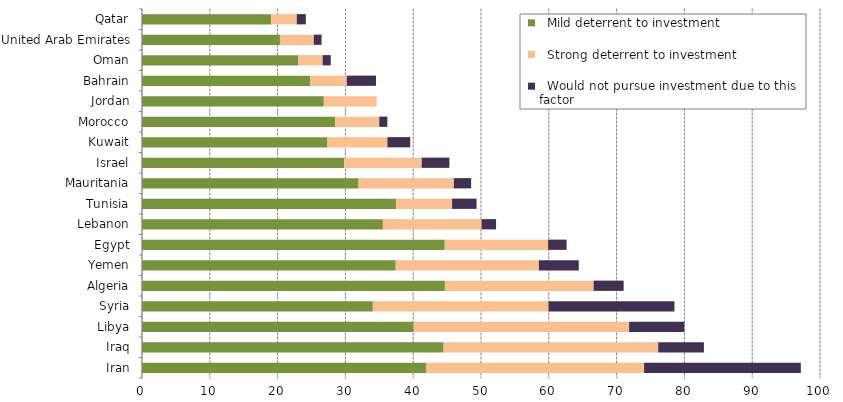
| Category |   Mild deterrent to investment |   Strong deterrent to investment |   Would not pursue investment due to this factor |
|---|---|---|---|
| Iran | 41.951 | 32.105 | 23.116 |
| Iraq | 44.489 | 31.651 | 6.737 |
| Libya | 40.067 | 31.782 | 8.134 |
| Syria | 34.044 | 25.92 | 18.569 |
| Algeria | 44.676 | 21.935 | 4.427 |
| Yemen | 37.424 | 21.118 | 5.881 |
| Egypt | 44.654 | 15.248 | 2.723 |
| Lebanon | 35.53 | 14.554 | 2.14 |
| Tunisia | 37.511 | 8.224 | 3.611 |
| Mauritania | 31.941 | 14.054 | 2.555 |
| Israel | 29.815 | 11.436 | 4.084 |
| Kuwait | 27.355 | 8.838 | 3.367 |
| Morocco | 28.473 | 6.525 | 1.186 |
| Jordan | 26.817 | 7.786 | 0 |
| Bahrain | 24.806 | 5.393 | 4.314 |
| Oman | 23.042 | 3.6 | 1.2 |
| United Arab Emirates | 20.346 | 4.99 | 1.152 |
| Qatar | 19.062 | 3.768 | 1.33 |